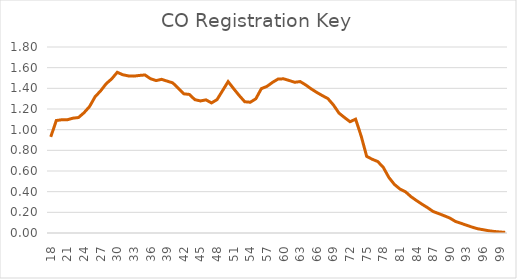
| Category | Series 0 |
|---|---|
| 18.0 | 0.931 |
| 19.0 | 1.088 |
| 20.0 | 1.096 |
| 21.0 | 1.096 |
| 22.0 | 1.111 |
| 23.0 | 1.117 |
| 24.0 | 1.164 |
| 25.0 | 1.224 |
| 26.0 | 1.319 |
| 27.0 | 1.376 |
| 28.0 | 1.445 |
| 29.0 | 1.492 |
| 30.0 | 1.555 |
| 31.0 | 1.531 |
| 32.0 | 1.52 |
| 33.0 | 1.518 |
| 34.0 | 1.525 |
| 35.0 | 1.529 |
| 36.0 | 1.493 |
| 37.0 | 1.475 |
| 38.0 | 1.487 |
| 39.0 | 1.47 |
| 40.0 | 1.453 |
| 41.0 | 1.401 |
| 42.0 | 1.347 |
| 43.0 | 1.341 |
| 44.0 | 1.29 |
| 45.0 | 1.278 |
| 46.0 | 1.289 |
| 47.0 | 1.259 |
| 48.0 | 1.291 |
| 49.0 | 1.378 |
| 50.0 | 1.465 |
| 51.0 | 1.396 |
| 52.0 | 1.331 |
| 53.0 | 1.27 |
| 54.0 | 1.266 |
| 55.0 | 1.299 |
| 56.0 | 1.397 |
| 57.0 | 1.419 |
| 58.0 | 1.457 |
| 59.0 | 1.49 |
| 60.0 | 1.492 |
| 61.0 | 1.476 |
| 62.0 | 1.459 |
| 63.0 | 1.465 |
| 64.0 | 1.433 |
| 65.0 | 1.394 |
| 66.0 | 1.36 |
| 67.0 | 1.33 |
| 68.0 | 1.301 |
| 69.0 | 1.239 |
| 70.0 | 1.16 |
| 71.0 | 1.117 |
| 72.0 | 1.077 |
| 73.0 | 1.102 |
| 74.0 | 0.94 |
| 75.0 | 0.742 |
| 76.0 | 0.714 |
| 77.0 | 0.692 |
| 78.0 | 0.635 |
| 79.0 | 0.538 |
| 80.0 | 0.47 |
| 81.0 | 0.426 |
| 82.0 | 0.399 |
| 83.0 | 0.351 |
| 84.0 | 0.314 |
| 85.0 | 0.278 |
| 86.0 | 0.245 |
| 87.0 | 0.208 |
| 88.0 | 0.188 |
| 89.0 | 0.167 |
| 90.0 | 0.145 |
| 91.0 | 0.112 |
| 92.0 | 0.094 |
| 93.0 | 0.075 |
| 94.0 | 0.057 |
| 95.0 | 0.041 |
| 96.0 | 0.032 |
| 97.0 | 0.022 |
| 98.0 | 0.015 |
| 99.0 | 0.01 |
| 100.0 | 0.006 |